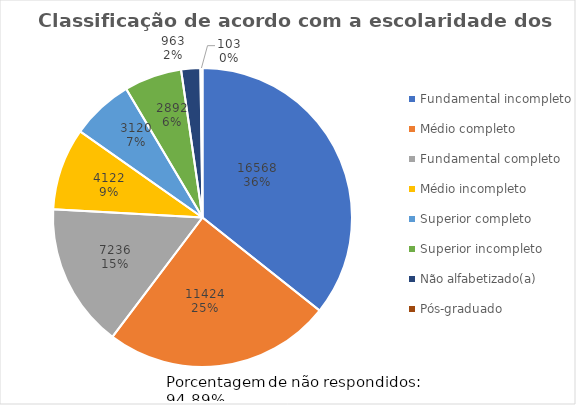
| Category | Series 0 |
|---|---|
| Fundamental incompleto    | 16568 |
| Médio completo            | 11424 |
| Fundamental completo      | 7236 |
| Médio incompleto          | 4122 |
| Superior completo         | 3120 |
| Superior incompleto       | 2892 |
| Não alfabetizado(a)       | 963 |
| Pós-graduado              | 103 |